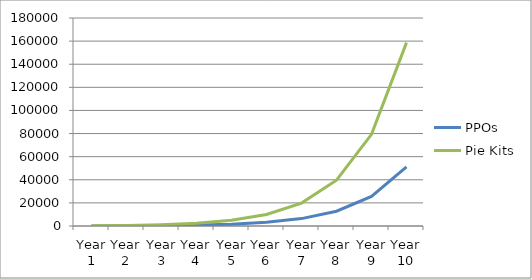
| Category | PPOs | Pie Kits |
|---|---|---|
| Year 1 | 100 | 160 |
| Year 2 | 200 | 480 |
| Year 3 | 400 | 1120 |
| Year 4 | 800 | 2400 |
| Year 5 | 1600 | 4960 |
| Year 6 | 3200 | 9920 |
| Year 7 | 6400 | 19840 |
| Year 8 | 12800 | 39680 |
| Year 9 | 25600 | 79360 |
| Year 10 | 51200 | 158720 |